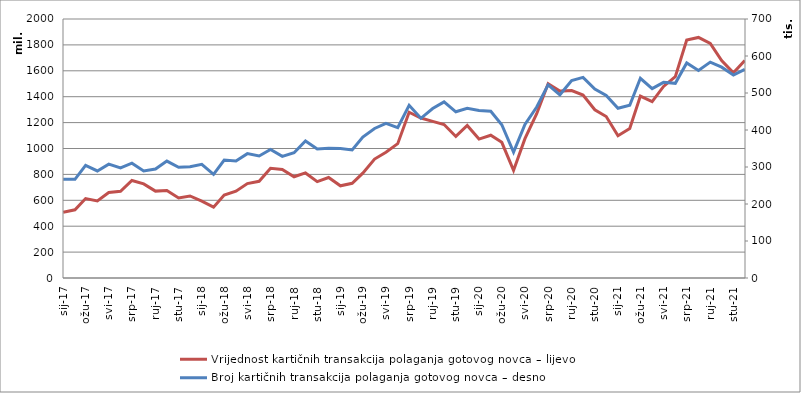
| Category | Vrijednost kartičnih transakcija polaganja gotovog novca – lijevo |
|---|---|
| 2017-01-01 | 508412726 |
| 2017-02-01 | 526671084 |
| 2017-03-01 | 613709645 |
| 2017-04-01 | 595689390 |
| 2017-05-01 | 660001053 |
| 2017-06-01 | 669163059 |
| 2017-07-01 | 752679258 |
| 2017-08-01 | 726381733 |
| 2017-09-01 | 670881190 |
| 2017-10-01 | 675163013 |
| 2017-11-01 | 617721565 |
| 2017-12-01 | 633509667 |
| 2018-01-01 | 593537981 |
| 2018-02-01 | 546771376 |
| 2018-03-01 | 640220334 |
| 2018-04-01 | 670424716 |
| 2018-05-01 | 729402406 |
| 2018-06-01 | 746835020 |
| 2018-07-01 | 846583207 |
| 2018-08-01 | 838599137 |
| 2018-09-01 | 781815328 |
| 2018-10-01 | 811370008 |
| 2018-11-01 | 743921866 |
| 2018-12-01 | 775906947 |
| 2019-01-01 | 712063577 |
| 2019-02-01 | 731526323 |
| 2019-03-01 | 809962786 |
| 2019-04-01 | 918558884 |
| 2019-05-01 | 971331588 |
| 2019-06-01 | 1037259537 |
| 2019-07-01 | 1280040384 |
| 2019-08-01 | 1235110215 |
| 2019-09-01 | 1209231103 |
| 2019-10-01 | 1185027154 |
| 2019-11-01 | 1093111411 |
| 2019-12-01 | 1177787327 |
| 2020-01-01 | 1072952586 |
| 2020-02-01 | 1102338502 |
| 2020-03-01 | 1047502957 |
| 2020-04-01 | 830776856 |
| 2020-05-01 | 1075984510 |
| 2020-06-01 | 1268477080 |
| 2020-07-01 | 1499928031 |
| 2020-08-01 | 1443089385 |
| 2020-09-01 | 1447095614 |
| 2020-10-01 | 1412786570 |
| 2020-11-01 | 1299232880 |
| 2020-12-01 | 1247037225 |
| 2021-01-01 | 1098555729 |
| 2021-02-01 | 1154884169 |
| 2021-03-01 | 1404873007 |
| 2021-04-01 | 1361872916 |
| 2021-05-01 | 1479031282 |
| 2021-06-01 | 1555272275 |
| 2021-07-01 | 1838011529 |
| 2021-08-01 | 1857717397 |
| 2021-09-01 | 1810855892 |
| 2021-10-01 | 1679510143 |
| 2021-11-01 | 1583870711 |
| 2021-12-01 | 1679526174 |